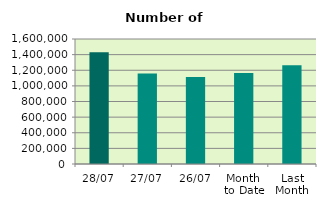
| Category | Series 0 |
|---|---|
| 28/07 | 1429238 |
| 27/07 | 1159778 |
| 26/07 | 1112210 |
| Month 
to Date | 1164182.8 |
| Last
Month | 1263143.455 |